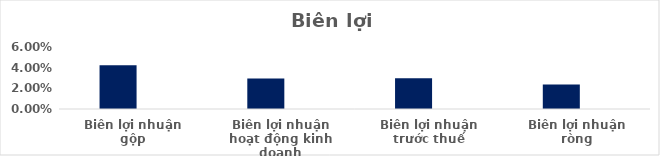
| Category | Series 0 | Series 1 | Series 2 | Series 3 | Series 4 |
|---|---|---|---|---|---|
| Biên lợi nhuận gộp | 0.042 |  |  |  |  |
| Biên lợi nhuận hoạt động kinh doanh | 0.029 |  |  |  |  |
| Biên lợi nhuận trước thuế | 0.03 |  |  |  |  |
| Biên lợi nhuận ròng | 0.024 |  |  |  |  |